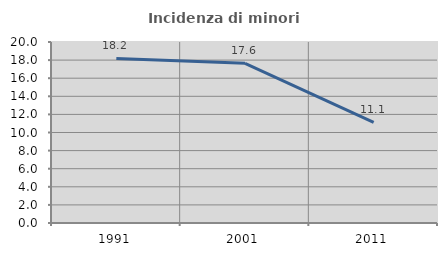
| Category | Incidenza di minori stranieri |
|---|---|
| 1991.0 | 18.182 |
| 2001.0 | 17.647 |
| 2011.0 | 11.111 |